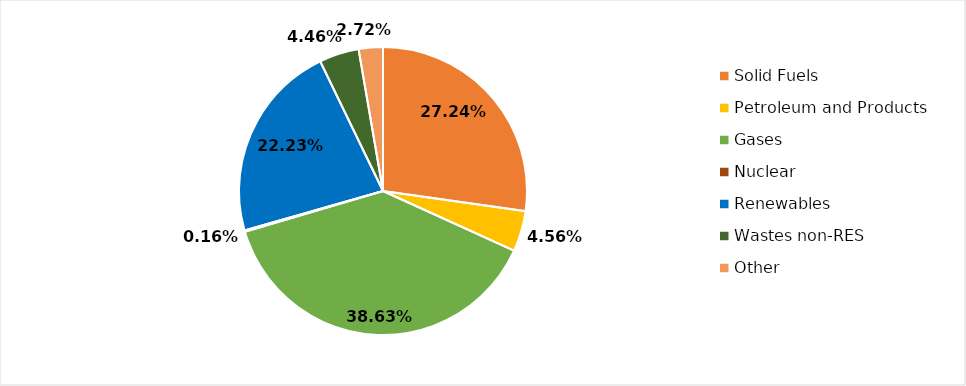
| Category | Series 0 |
|---|---|
| Solid Fuels | 0.272 |
| Petroleum and Products | 0.046 |
| Gases | 0.386 |
| Nuclear | 0.002 |
| Renewables | 0.222 |
| Wastes non-RES | 0.045 |
| Other | 0.027 |